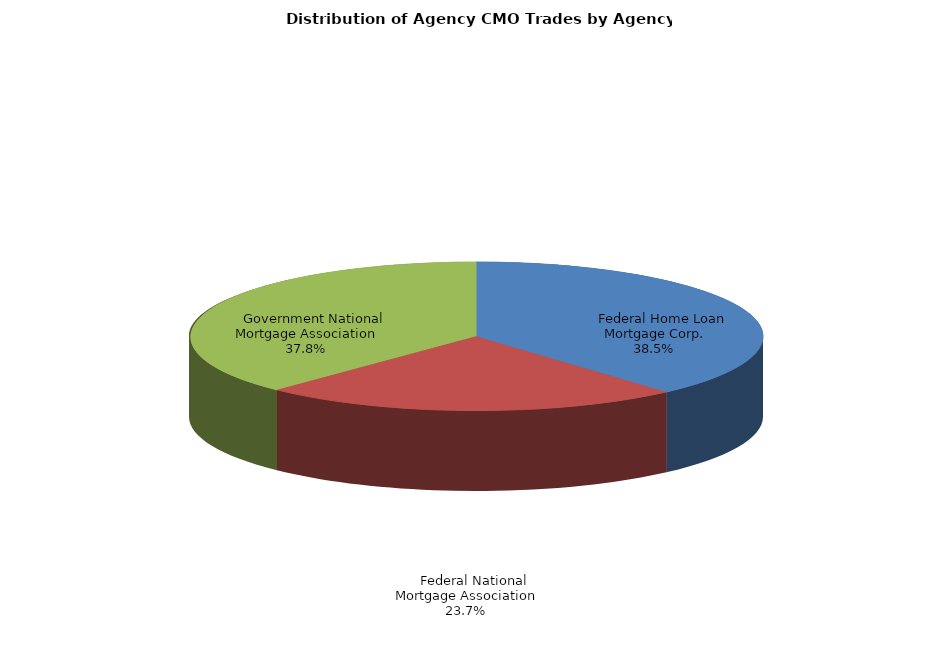
| Category | Series 0 |
|---|---|
|     Federal Home Loan Mortgage Corp. | 309.076 |
|     Federal National Mortgage Association | 190.749 |
|     Government National Mortgage Association | 303.833 |